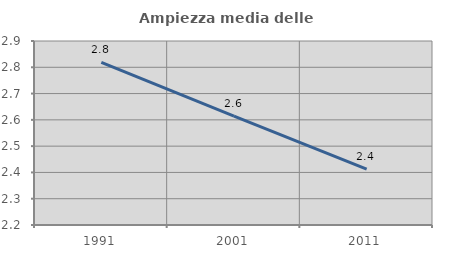
| Category | Ampiezza media delle famiglie |
|---|---|
| 1991.0 | 2.819 |
| 2001.0 | 2.614 |
| 2011.0 | 2.413 |